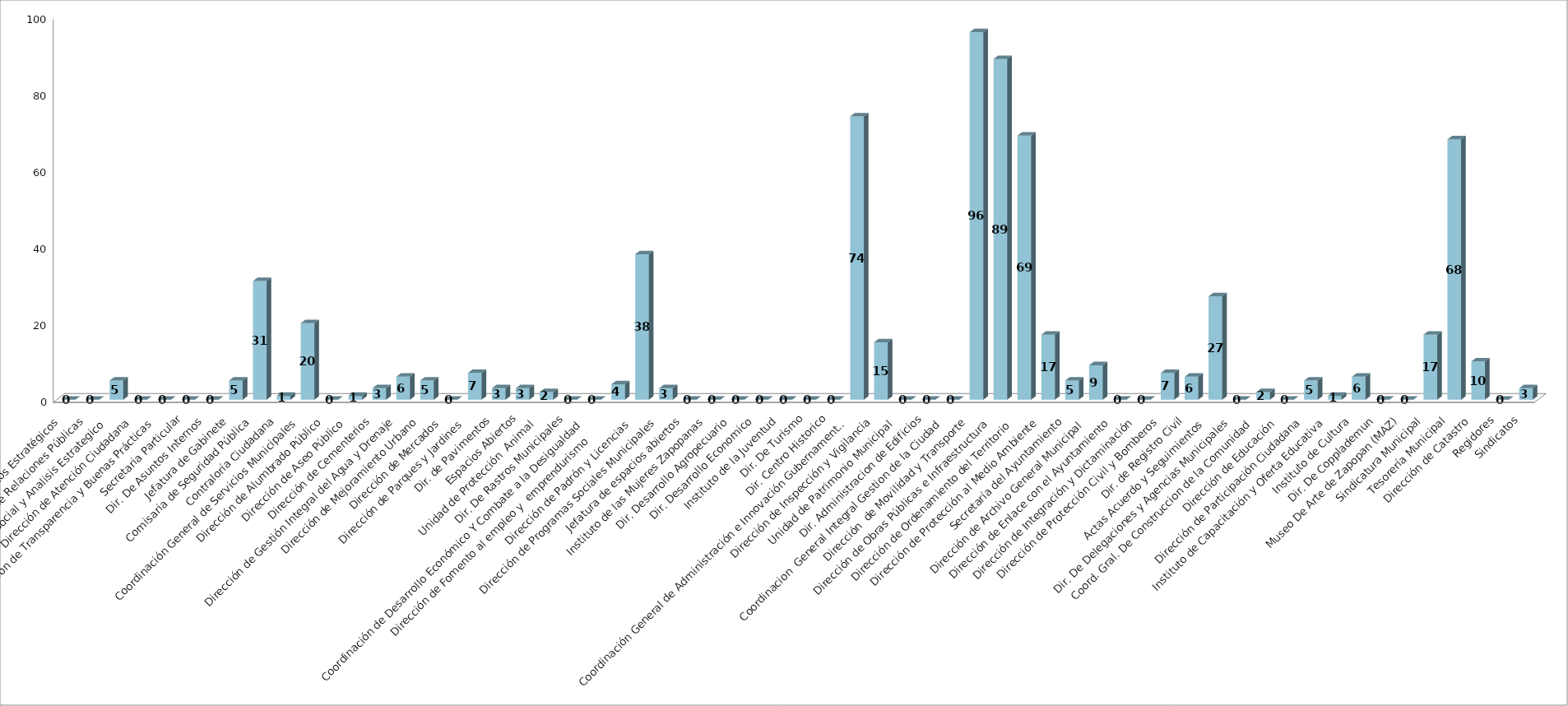
| Category | Series 0 | Series 1 |
|---|---|---|
| Area de Proyectos Estratégicos |  | 0 |
| Área de Relaciones Públicas |  | 0 |
| Comunicación Social y Analisis Estrategico  |  | 5 |
| Dirección de Atención Ciudadana |  | 0 |
| Dirección de Transparencia y Buenas Prácticas |  | 0 |
| Secretaria Particular |  | 0 |
| Dir. De Asuntos Internos |  | 0 |
| Jefatura de Gabinete |  | 5 |
| Comisaria de Seguridad Pública |  | 31 |
| Contraloría Ciudadana |  | 1 |
| Coordinación General de Servicios Municipales |  | 20 |
| Dirección de Alumbrado Público |  | 0 |
| Dirección de Aseo Público  |  | 1 |
| Dirección de Cementerios |  | 3 |
| Dirección de Gestión Integral del Agua y Drenaje |  | 6 |
| Dirección de Mejoramiento Urbano |  | 5 |
| Dirección de Mercados  |  | 0 |
| Dirección de Parques y Jardines  |  | 7 |
| Dir. de Pavimentos |  | 3 |
| Espacios Abiertos |  | 3 |
| Unidad de Protección  Animal  |  | 2 |
| Dir. De Rastros Municipales |  | 0 |
| Coordinación de Desarrollo Económico Y Combate a la Desigualdad |  | 0 |
| Dirección de Fomento al empleo y  emprendurismo         |  | 4 |
| Dirección de Padrón y Licencias  |  | 38 |
| Dirección de Programas Sociales Municipales |  | 3 |
| Jefatura de espacios abiertos |  | 0 |
| Instituto de las Mujeres Zapopanas |  | 0 |
|  Dir. Desarrollo Agropecuario |  | 0 |
| Dir. Desarrollo Economico |  | 0 |
| Instituto de la Juventud |  | 0 |
| Dir. De Turismo |  | 0 |
| Dir. Centro Historico |  | 0 |
| Coordinación General de Administración e Innovación Gubernamental |  | 74 |
| Dirección de Inspección y Vigilancia |  | 15 |
| Unidad de Patrimonio Municipal  |  | 0 |
| Dir. Administracion de Edificios |  | 0 |
| Coordinacion  General Integral Gestion de la Ciudad |  | 0 |
| Dirección  de Movilidad y Transporte |  | 96 |
| Dirección de Obras Públicas e Infraestructura |  | 89 |
| Dirección de Ordenamiento del Territorio  |  | 69 |
| Dirección de Protección al Medio Ambiente  |  | 17 |
| Secretaría del Ayuntamiento |  | 5 |
| Dirección de Archivo General Municipal  |  | 9 |
| Dirección de Enlace con el Ayuntamiento |  | 0 |
| Dirección de Integración y Dictaminación |  | 0 |
| Dirección de Protección Civil y Bomberos |  | 7 |
| Dir. de Registro Civil |  | 6 |
| Actas Acuerdo y Seguimientos  |  | 27 |
| Dir. De Delegaciones y Agencias Municipales |  | 0 |
| Coord. Gral. De Construccion de la Comunidad |  | 2 |
| Dirección de Educación  |  | 0 |
| Dirección de Participación Ciudadana |  | 5 |
| Instituto de Capacitación y Oferta Educativa |  | 1 |
| Instituto de Cultura  |  | 6 |
| Dir. De Copplademun |  | 0 |
| Museo De Arte de Zapopan (MAZ) |  | 0 |
| Sindicatura Municipal |  | 17 |
| Tesorería Municipal |  | 68 |
| Dirección de Catastro |  | 10 |
| Regidores |  | 0 |
| Sindicatos |  | 3 |